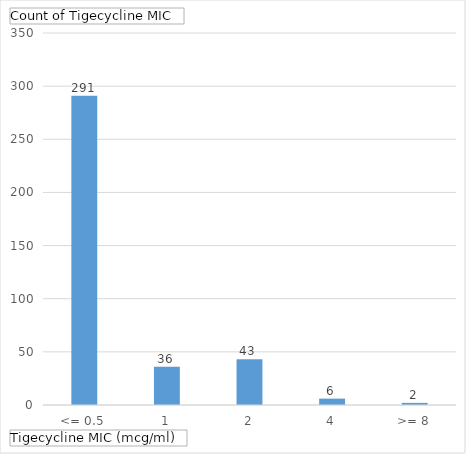
| Category | Total |
|---|---|
| <= 0.5 | 291 |
| 1 | 36 |
| 2 | 43 |
| 4 | 6 |
| >= 8 | 2 |